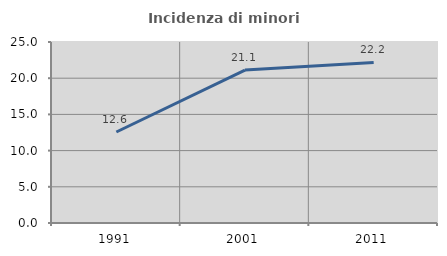
| Category | Incidenza di minori stranieri |
|---|---|
| 1991.0 | 12.571 |
| 2001.0 | 21.127 |
| 2011.0 | 22.18 |